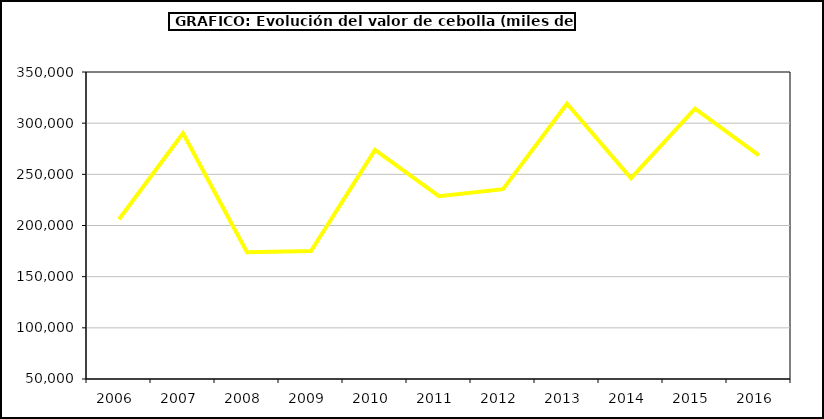
| Category | Valor |
|---|---|
| 2006.0 | 206165.812 |
| 2007.0 | 290141.25 |
| 2008.0 | 173831.053 |
| 2009.0 | 175000.918 |
| 2010.0 | 273851.462 |
| 2011.0 | 228687.172 |
| 2012.0 | 235464.837 |
| 2013.0 | 318927.963 |
| 2014.0 | 246223.118 |
| 2015.0 | 314225 |
| 2016.0 | 268515 |